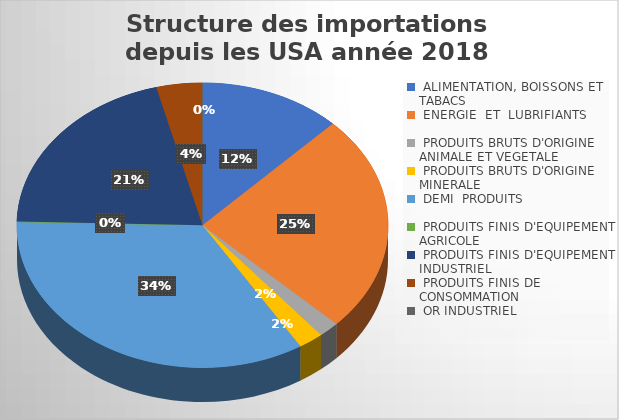
| Category | Series 0 |
|---|---|
| ALIMENTATION, BOISSONS ET TABACS | 8202932540.266 |
| ENERGIE  ET  LUBRIFIANTS | 16441571258.91 |
| PRODUITS BRUTS D'ORIGINE ANIMALE ET VEGETALE | 1203330481.544 |
| PRODUITS BRUTS D'ORIGINE MINERALE | 1448078318.62 |
| DEMI  PRODUITS | 22671872022.477 |
| PRODUITS FINIS D'EQUIPEMENT AGRICOLE | 23098715.12 |
| PRODUITS FINIS D'EQUIPEMENT INDUSTRIEL | 13651120217.381 |
| PRODUITS FINIS DE CONSOMMATION | 2653148819.052 |
| OR INDUSTRIEL  | 233480 |